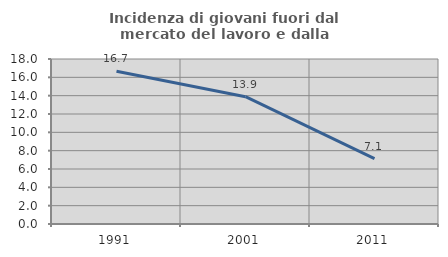
| Category | Incidenza di giovani fuori dal mercato del lavoro e dalla formazione  |
|---|---|
| 1991.0 | 16.667 |
| 2001.0 | 13.889 |
| 2011.0 | 7.143 |